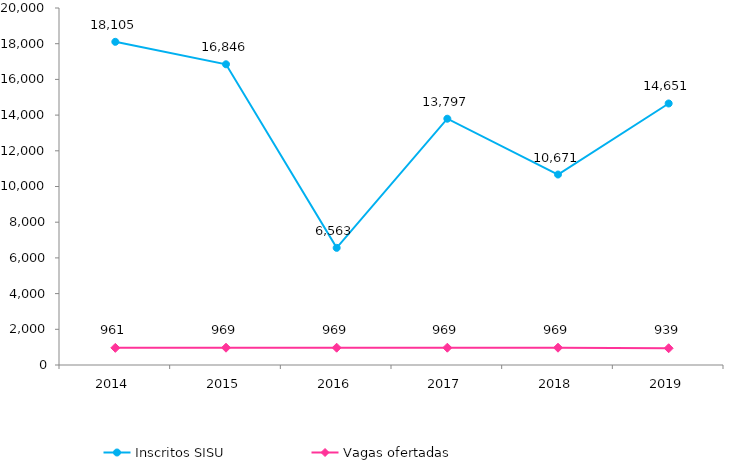
| Category | Inscritos SISU |
|---|---|
| 2014.0 | 18105 |
| 2015.0 | 16846 |
| 2016.0 | 6563 |
| 2017.0 | 13797 |
| 2018.0 | 10671 |
| 2019.0 | 14651 |